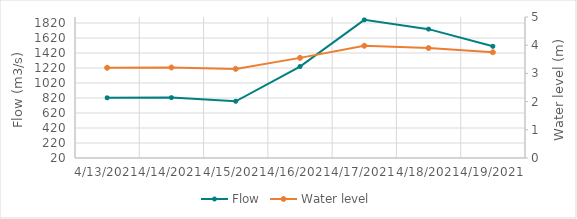
| Category | Flow |
|---|---|
| 4/18/21 | 1765.94 |
| 4/17/21 | 1861.82 |
| 4/16/21 | 1239.6 |
| 4/15/21 | 777.64 |
| 4/14/21 | 825.13 |
| 4/13/21 | 822.91 |
| 4/12/21 | 929.44 |